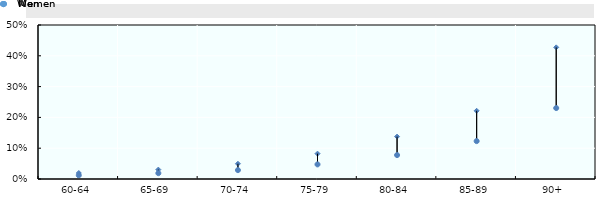
| Category | Women | Men |
|---|---|---|
| 60-64 | 0.019 | 0.012 |
| 65-69 | 0.03 | 0.019 |
| 70-74 | 0.049 | 0.029 |
| 75-79 | 0.082 | 0.047 |
| 80-84 | 0.138 | 0.078 |
| 85-89 | 0.221 | 0.123 |
| 90+ | 0.427 | 0.23 |